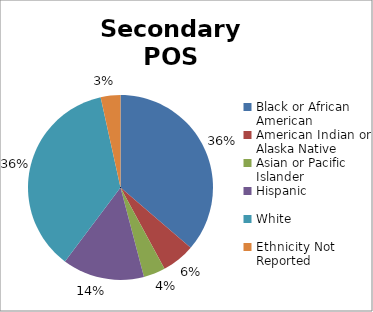
| Category | Series 0 |
|---|---|
| Black or African American | 0.363 |
| American Indian or Alaska Native | 0.058 |
| Asian or Pacific Islander | 0.038 |
| Hispanic | 0.143 |
| White | 0.363 |
| Ethnicity Not Reported | 0.034 |